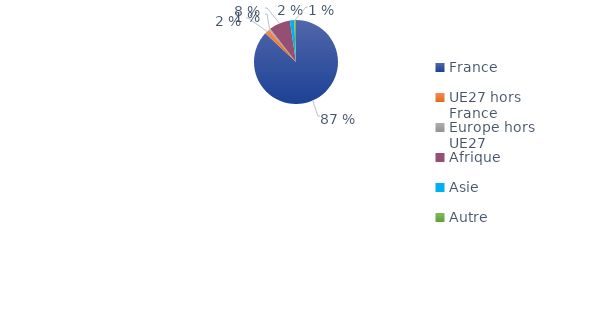
| Category | Series 0 |
|---|---|
| France | 0.87 |
| UE27 hors France | 0.019 |
| Europe hors UE27 | 0.006 |
| Afrique | 0.082 |
| Asie | 0.017 |
| Autre | 0.007 |